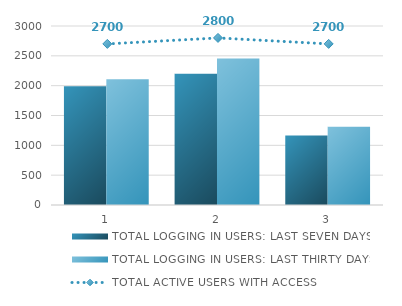
| Category | TOTAL LOGGING IN USERS: LAST SEVEN DAYS | TOTAL LOGGING IN USERS: LAST THIRTY DAYS |
|---|---|---|
| 0 | 1989 | 2107 |
| 1 | 2200 | 2456 |
| 2 | 1165 | 1311 |